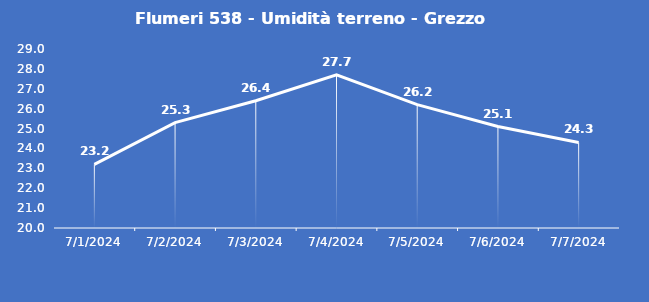
| Category | Flumeri 538 - Umidità terreno - Grezzo (%VWC) |
|---|---|
| 7/1/24 | 23.2 |
| 7/2/24 | 25.3 |
| 7/3/24 | 26.4 |
| 7/4/24 | 27.7 |
| 7/5/24 | 26.2 |
| 7/6/24 | 25.1 |
| 7/7/24 | 24.3 |